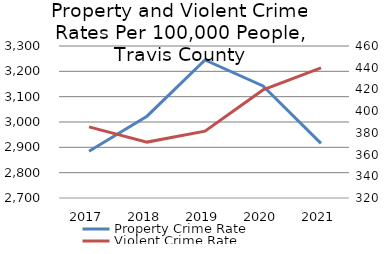
| Category | Property Crime Rate            |
|---|---|
| 2017.0 | 2884.651 |
| 2018.0 | 3022.932 |
| 2019.0 | 3244.869 |
| 2020.0 | 3142.266 |
| 2021.0 | 2915.474 |